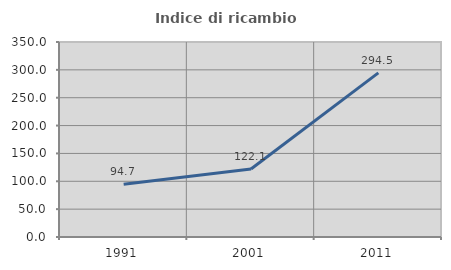
| Category | Indice di ricambio occupazionale  |
|---|---|
| 1991.0 | 94.715 |
| 2001.0 | 122.063 |
| 2011.0 | 294.539 |